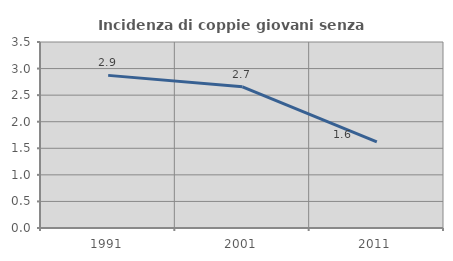
| Category | Incidenza di coppie giovani senza figli |
|---|---|
| 1991.0 | 2.872 |
| 2001.0 | 2.657 |
| 2011.0 | 1.622 |